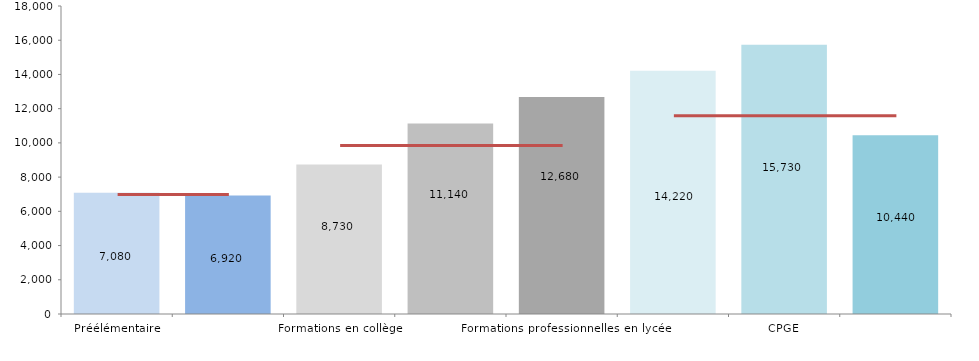
| Category | Series 0 |
|---|---|
| Préélémentaire | 7080 |
| Élémentaire | 6920 |
| Formations en collège | 8730 |
| Formations générales et technologiques en lycée | 11140 |
| Formations professionnelles en lycée | 12680 |
| STS | 14220 |
| CPGE | 15730 |
| Universités  | 10440 |